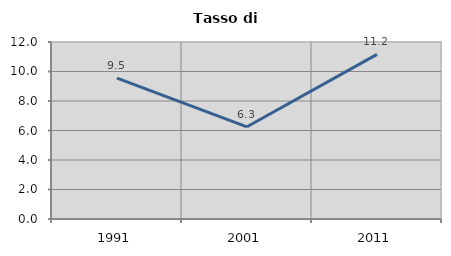
| Category | Tasso di disoccupazione   |
|---|---|
| 1991.0 | 9.545 |
| 2001.0 | 6.25 |
| 2011.0 | 11.16 |